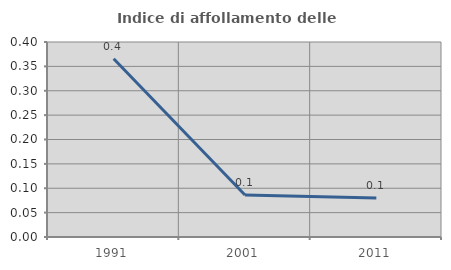
| Category | Indice di affollamento delle abitazioni  |
|---|---|
| 1991.0 | 0.366 |
| 2001.0 | 0.086 |
| 2011.0 | 0.08 |